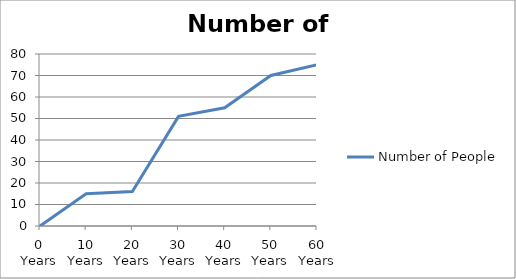
| Category | Number of People |
|---|---|
| 0 Years | 0 |
| 10 Years | 15 |
| 20 Years | 16 |
| 30 Years | 51 |
| 40 Years | 55 |
| 50 Years | 70 |
| 60 Years | 75 |